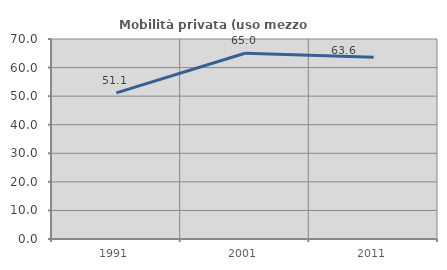
| Category | Mobilità privata (uso mezzo privato) |
|---|---|
| 1991.0 | 51.148 |
| 2001.0 | 65.008 |
| 2011.0 | 63.646 |